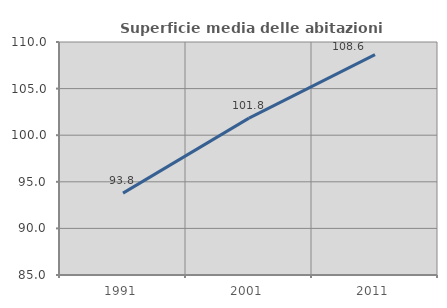
| Category | Superficie media delle abitazioni occupate |
|---|---|
| 1991.0 | 93.788 |
| 2001.0 | 101.834 |
| 2011.0 | 108.647 |